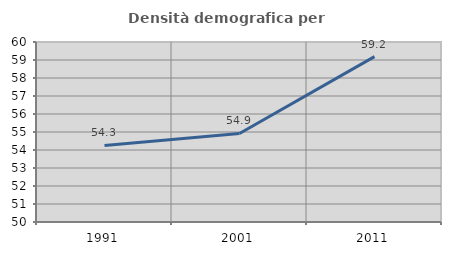
| Category | Densità demografica |
|---|---|
| 1991.0 | 54.253 |
| 2001.0 | 54.921 |
| 2011.0 | 59.188 |